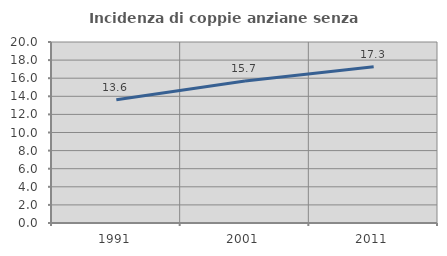
| Category | Incidenza di coppie anziane senza figli  |
|---|---|
| 1991.0 | 13.611 |
| 2001.0 | 15.693 |
| 2011.0 | 17.258 |